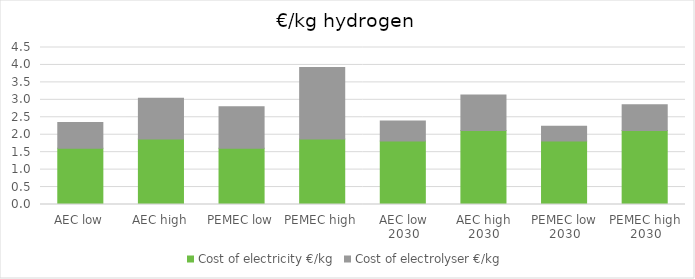
| Category | Cost of electricity €/kg | Cost of electrolyser €/kg |
|---|---|---|
| AEC low | 1.612 | 0.738 |
| AEC high | 1.88 | 1.163 |
| PEMEC low | 1.612 | 1.187 |
| PEMEC high | 1.88 | 2.046 |
| AEC low 2030 | 1.82 | 0.576 |
| AEC high 2030 | 2.124 | 1.018 |
| PEMEC low 2030 | 1.82 | 0.424 |
| PEMEC high 2030 | 2.124 | 0.737 |